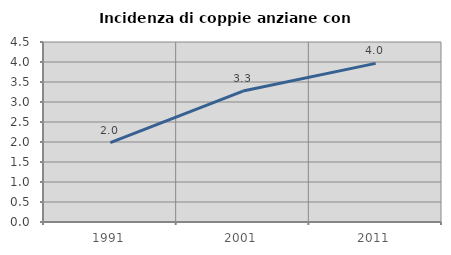
| Category | Incidenza di coppie anziane con figli |
|---|---|
| 1991.0 | 1.983 |
| 2001.0 | 3.274 |
| 2011.0 | 3.966 |